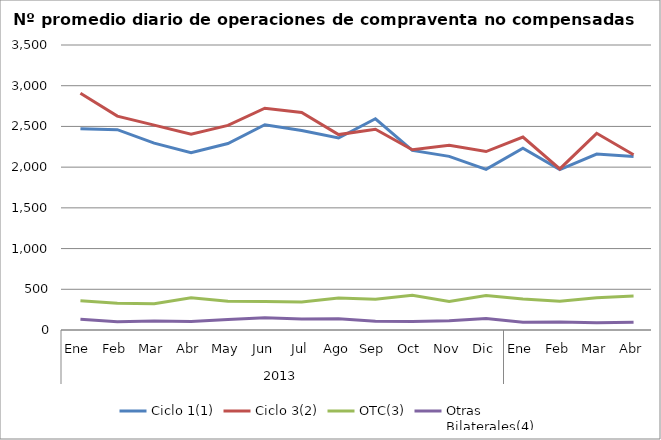
| Category | Ciclo 1(1) | Ciclo 3(2) | OTC(3) | Otras
Bilaterales(4) |
|---|---|---|---|---|
| 0 | 2472.091 | 2907.273 | 357.864 | 131.409 |
| 1 | 2459.8 | 2626.25 | 327.5 | 100.6 |
| 2 | 2294.6 | 2516 | 323.75 | 111.65 |
| 3 | 2176.182 | 2403.364 | 394.818 | 103.364 |
| 4 | 2290.048 | 2512.714 | 352.095 | 130.143 |
| 5 | 2520.75 | 2724.25 | 349.7 | 151.05 |
| 6 | 2449.045 | 2670.182 | 344.818 | 134.5 |
| 7 | 2357.333 | 2400.048 | 392.524 | 137.571 |
| 8 | 2593.778 | 2465 | 376.889 | 108.389 |
| 9 | 2205.955 | 2213.318 | 425.318 | 105.636 |
| 10 | 2132.1 | 2268.1 | 350 | 113.75 |
| 11 | 1972.35 | 2191.55 | 424.35 | 141.55 |
| 12 | 2231.227 | 2368.955 | 379.864 | 95 |
| 13 | 1969.85 | 1978.25 | 352.25 | 97.9 |
| 14 | 2160.619 | 2415.286 | 395.857 | 87.762 |
| 15 | 2130.667 | 2153.048 | 416.143 | 96 |